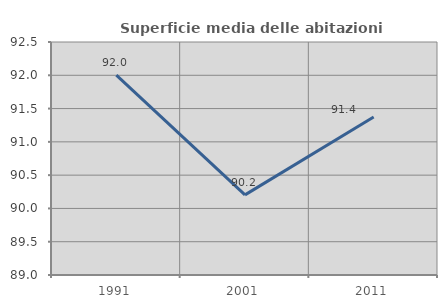
| Category | Superficie media delle abitazioni occupate |
|---|---|
| 1991.0 | 92.002 |
| 2001.0 | 90.204 |
| 2011.0 | 91.373 |